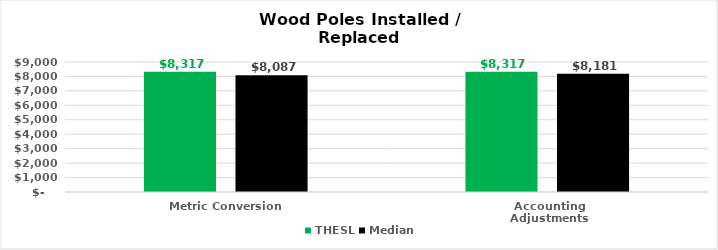
| Category | THESL | Median |
|---|---|---|
| Metric Conversion | 8317.443 | 8087.184 |
| Accounting Adjustments | 8317.443 | 8181.053 |